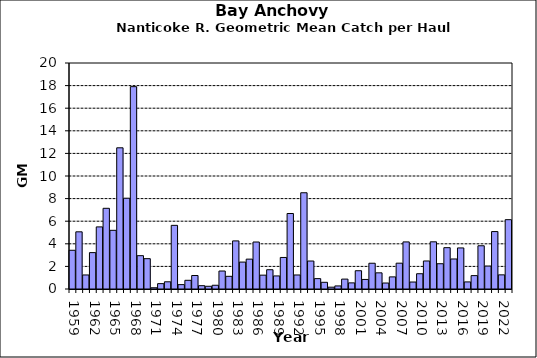
| Category | Series 0 |
|---|---|
| 1959.0 | 3.428 |
| 1960.0 | 5.06 |
| 1961.0 | 1.243 |
| 1962.0 | 3.22 |
| 1963.0 | 5.496 |
| 1964.0 | 7.141 |
| 1965.0 | 5.193 |
| 1966.0 | 12.495 |
| 1967.0 | 8.035 |
| 1968.0 | 17.907 |
| 1969.0 | 2.949 |
| 1970.0 | 2.685 |
| 1971.0 | 0.109 |
| 1972.0 | 0.474 |
| 1973.0 | 0.639 |
| 1974.0 | 5.633 |
| 1975.0 | 0.388 |
| 1976.0 | 0.769 |
| 1977.0 | 1.194 |
| 1978.0 | 0.293 |
| 1979.0 | 0.242 |
| 1980.0 | 0.331 |
| 1981.0 | 1.59 |
| 1982.0 | 1.122 |
| 1983.0 | 4.256 |
| 1984.0 | 2.382 |
| 1985.0 | 2.643 |
| 1986.0 | 4.158 |
| 1987.0 | 1.226 |
| 1988.0 | 1.705 |
| 1989.0 | 1.156 |
| 1990.0 | 2.791 |
| 1991.0 | 6.68 |
| 1992.0 | 1.24 |
| 1993.0 | 8.518 |
| 1994.0 | 2.476 |
| 1995.0 | 0.919 |
| 1996.0 | 0.593 |
| 1997.0 | 0.161 |
| 1998.0 | 0.272 |
| 1999.0 | 0.875 |
| 2000.0 | 0.542 |
| 2001.0 | 1.616 |
| 2002.0 | 0.846 |
| 2003.0 | 2.279 |
| 2004.0 | 1.43 |
| 2005.0 | 0.53 |
| 2006.0 | 1.072 |
| 2007.0 | 2.284 |
| 2008.0 | 4.166 |
| 2009.0 | 0.618 |
| 2010.0 | 1.352 |
| 2011.0 | 2.48 |
| 2012.0 | 4.175 |
| 2013.0 | 2.236 |
| 2014.0 | 3.657 |
| 2015.0 | 2.658 |
| 2016.0 | 3.634 |
| 2017.0 | 0.627 |
| 2018.0 | 1.184 |
| 2019.0 | 3.827 |
| 2020.0 | 2.03 |
| 2021.0 | 5.082 |
| 2022.0 | 1.252 |
| 2023.0 | 6.135 |